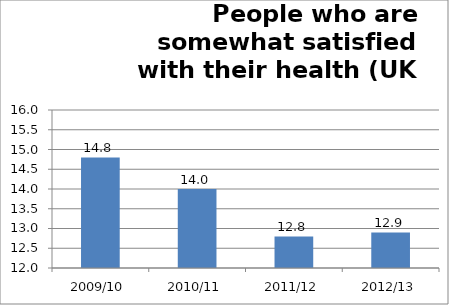
| Category | Series 0 |
|---|---|
| 2009/10 | 14.8 |
| 2010/11 | 14 |
| 2011/12 | 12.8 |
| 2012/13 | 12.9 |